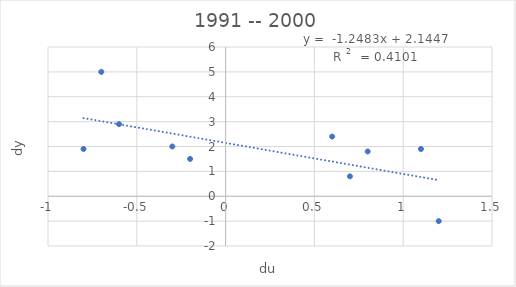
| Category | dy |
|---|---|
| -0.7000000000000002 | 5 |
| 1.0999999999999996 | 1.9 |
| 1.2000000000000002 | -1 |
| 0.6000000000000005 | 2.4 |
| -0.20000000000000107 | 1.5 |
| 0.7000000000000011 | 0.8 |
| 0.7999999999999989 | 1.8 |
| -0.29999999999999893 | 2 |
| -0.8000000000000007 | 1.9 |
| -0.5999999999999996 | 2.9 |